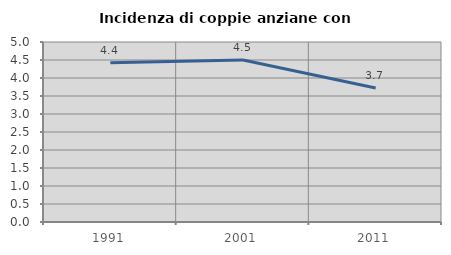
| Category | Incidenza di coppie anziane con figli |
|---|---|
| 1991.0 | 4.425 |
| 2001.0 | 4.5 |
| 2011.0 | 3.723 |